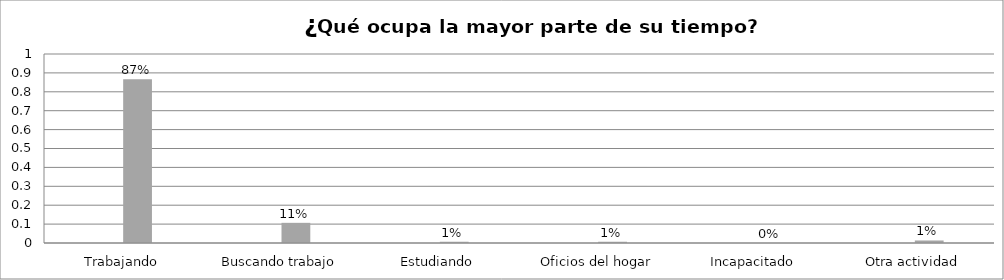
| Category | Series 0 | Series 1 | Series 2 | Series 3 |
|---|---|---|---|---|
| Trabajando |  |  | 0.867 |  |
| Buscando trabajo |  |  | 0.107 |  |
| Estudiando |  |  | 0.007 |  |
| Oficios del hogar |  |  | 0.007 |  |
| Incapacitado  |  |  | 0 |  |
| Otra actividad |  |  | 0.013 |  |